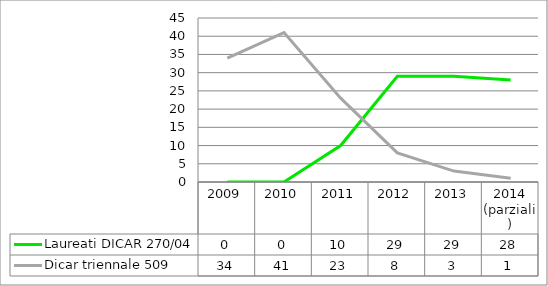
| Category | Laureati DICAR 270/04 | Dicar triennale 509 |
|---|---|---|
| 2009 | 0 | 34 |
| 2010 | 0 | 41 |
| 2011 | 10 | 23 |
| 2012 | 29 | 8 |
| 2013 | 29 | 3 |
| 2014
(parziali) | 28 | 1 |